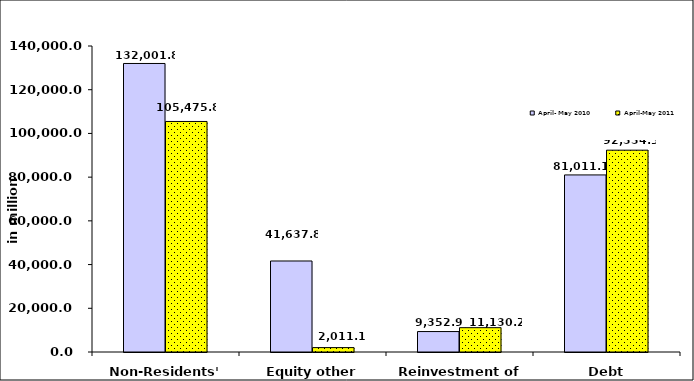
| Category | April- May 2010 | April-May 2011 |
|---|---|---|
| Non-Residents' investments 
in the Phils. | 132001.802 | 105475.796 |
| Equity other than reinvestment of earnings | 41637.814 | 2011.108 |
| Reinvestment of earnings | 9352.891 | 11130.226 |
| Debt instruments, net | 81011.097 | 92334.462 |